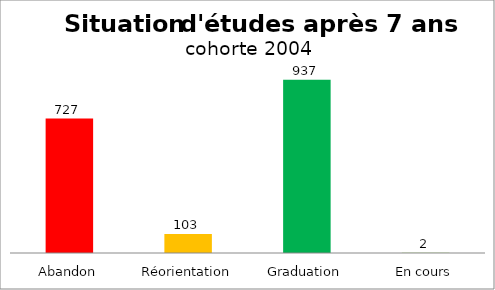
| Category | Ensemble UNIL |
|---|---|
| Abandon | 727 |
| Réorientation | 103 |
| Graduation | 937 |
| En cours | 2 |